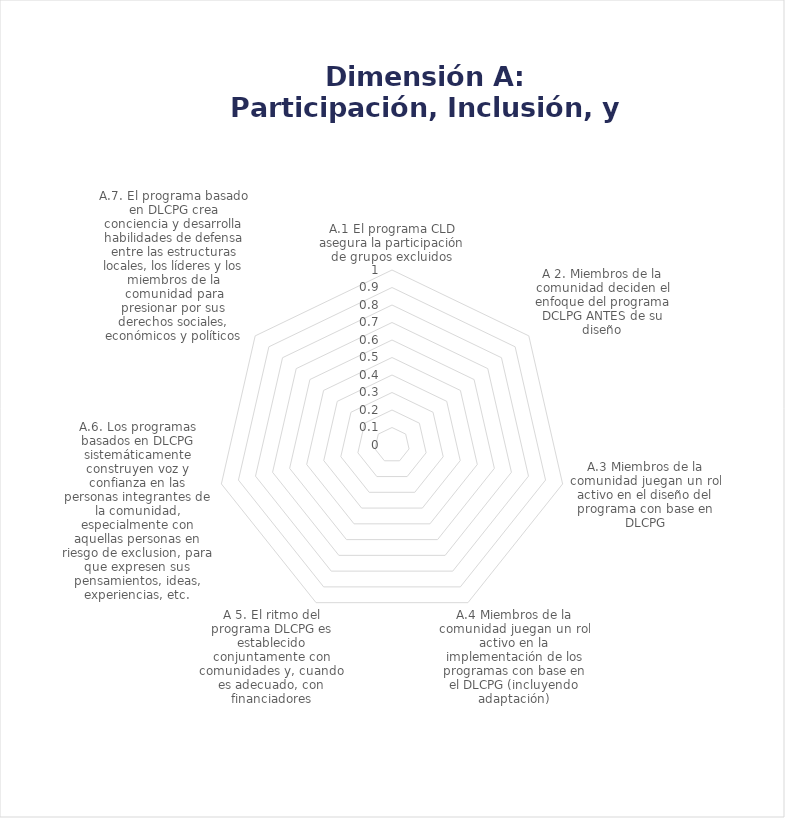
| Category | Series 0 |
|---|---|
| A.1 El programa CLD asegura la participación de grupos excluidos | 0 |
| A 2. Miembros de la comunidad deciden el enfoque del programa DCLPG ANTES de su diseño | 0 |
| A.3 Miembros de la comunidad juegan un rol activo en el diseño del programa con base en DLCPG | 0 |
| A.4 Miembros de la comunidad juegan un rol activo en la implementación de los programas con base en el DLCPG (incluyendo adaptación) | 0 |
| A 5. El ritmo del programa DLCPG es establecido conjuntamente con comunidades y, cuando es adecuado, con financiadores | 0 |
| A.6. Los programas basados en DLCPG sistemáticamente construyen voz y confianza en las personas integrantes de la comunidad, especialmente con aquellas personas en riesgo de exclusion, para que expresen sus pensamientos, ideas, experiencias, etc. | 0 |
| A.7. El programa basado en DLCPG crea conciencia y desarrolla habilidades de defensa entre las estructuras locales, los líderes y los miembros de la comunidad para presionar por sus derechos sociales, económicos y políticos | 0 |